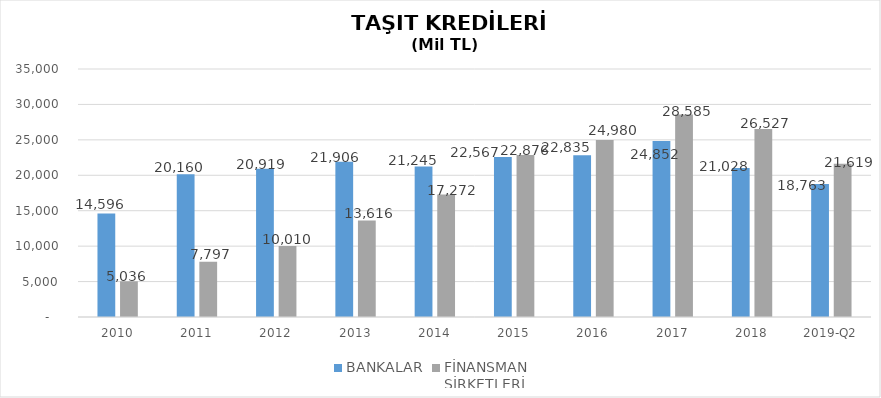
| Category | BANKALAR | FİNANSMAN 
ŞİRKETLERİ |
|---|---|---|
| 2010 | 14596 | 5035.89 |
| 2011 | 20160 | 7796.854 |
| 2012 | 20919 | 10009.755 |
| 2013 | 21906 | 13616.036 |
| 2014 | 21245 | 17271.844 |
| 2015 | 22567 | 22875.563 |
| 2016 | 22835 | 24980.231 |
| 2017 | 24852 | 28584.938 |
| 2018 | 21028 | 26527.133 |
| 2019-Q2 | 18763 | 21618.528 |